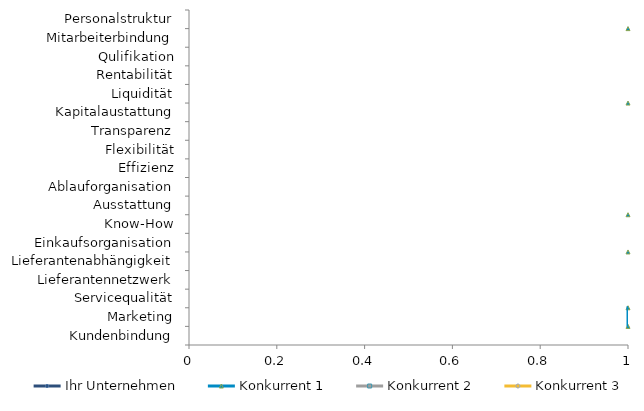
| Category | Neue Datenreihe |
|---|---|
| Kundenbindung | 0 |
| Marketing | 0 |
| Servicequalität | 0 |
| Lieferantennetzwerk | 0 |
| Lieferantenabhängigkeit | 0 |
| Einkaufsorganisation | 0 |
| Know-How | 0 |
| Ausstattung | 0 |
| Ablauforganisation | 0 |
| Effizienz | 0 |
| Flexibilität | 0 |
| Transparenz | 0 |
| Kapitalaustattung | 0 |
| Liquidität | 0 |
| Rentabilität | 0 |
| Qulifikation | 0 |
| Mitarbeiterbindung | 0 |
| Personalstruktur | 0 |